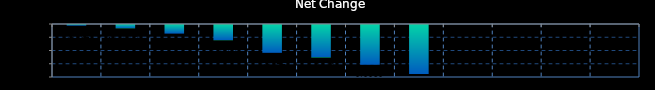
| Category | Series 0 |
|---|---|
| 0 | 0 |
| 1 | -0.001 |
| 2 | -0.001 |
| 3 | -0.002 |
| 4 | -0.004 |
| 5 | -0.005 |
| 6 | -0.006 |
| 7 | -0.007 |
| 8 | 0 |
| 9 | 0 |
| 10 | 0 |
| 11 | 0 |